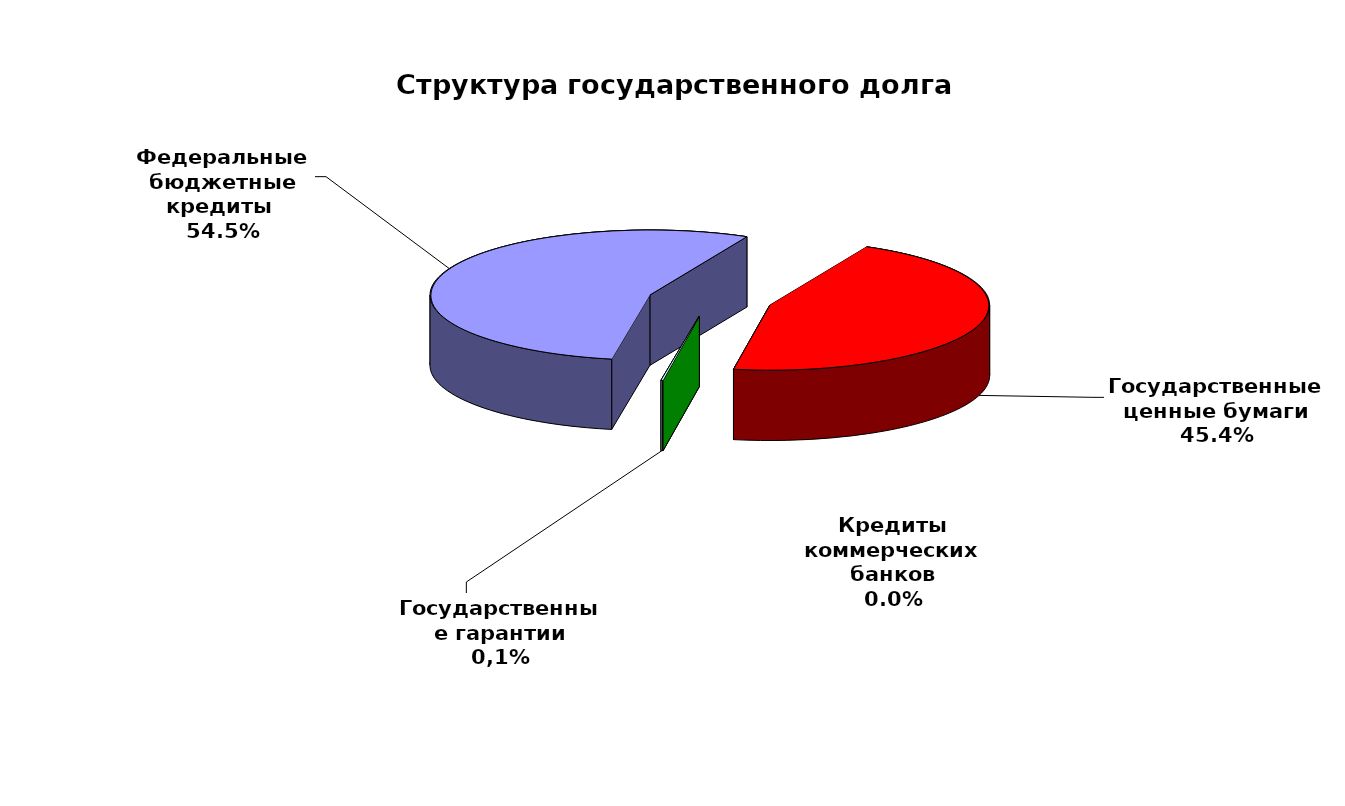
| Category | Series 0 |
|---|---|
| Федеральные бюджетные кредиты  | 55743267.513 |
| Государственные ценные бумаги | 46400000 |
| Кредиты коммерческих банков | 0 |
| Государственные гарантии | 138270.964 |